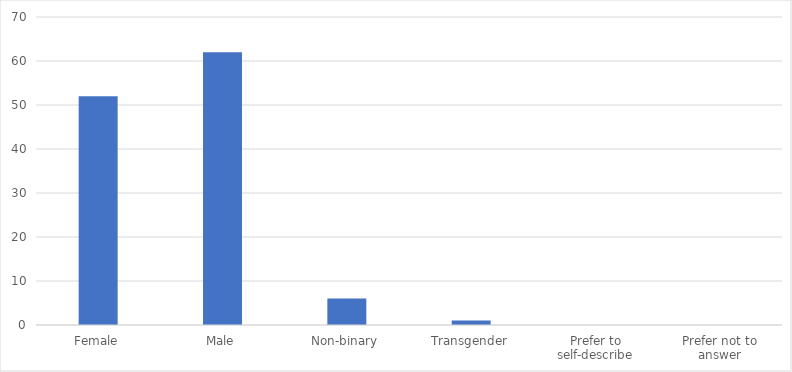
| Category | Number of Responses |
|---|---|
| Female | 52 |
| Male | 62 |
| Non-binary | 6 |
| Transgender | 1 |
| Prefer to self-describe | 0 |
| Prefer not to answer | 0 |